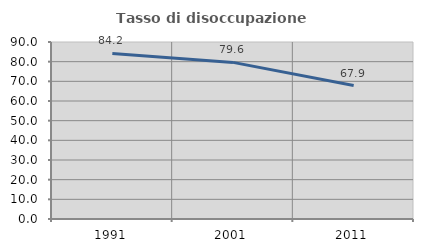
| Category | Tasso di disoccupazione giovanile  |
|---|---|
| 1991.0 | 84.211 |
| 2001.0 | 79.63 |
| 2011.0 | 67.857 |